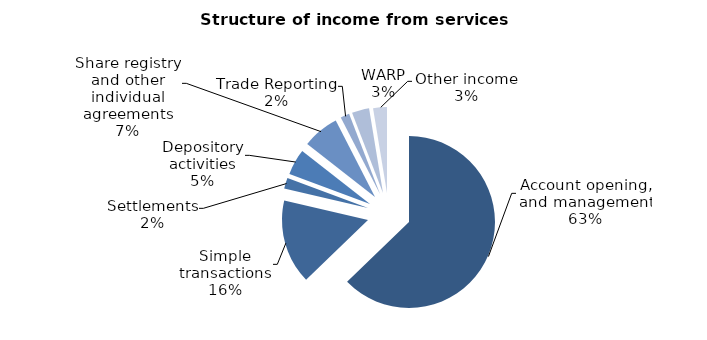
| Category | Series 0 |
|---|---|
| Account opening, and management | 2677.5 |
| Simple transactions | 675 |
| Settlements | 87.6 |
| Depository activities | 207.8 |
| Share registry and other individual agreements | 294.6 |
| Trade Reporting | 71.8 |
| WARP | 139.1 |
| Other income | 110.6 |